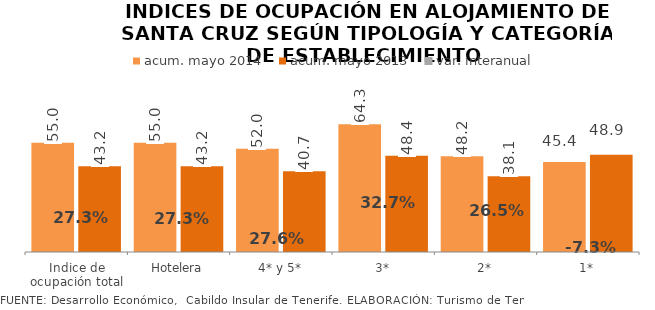
| Category | acum. mayo 2014 | acum. mayo 2013 |
|---|---|---|
| Indice de ocupación total | 54.968 | 43.186 |
| Hotelera | 54.968 | 43.186 |
| 4* y 5* | 51.961 | 40.719 |
| 3* | 64.284 | 48.438 |
| 2* | 48.198 | 38.11 |
| 1* | 45.355 | 48.943 |